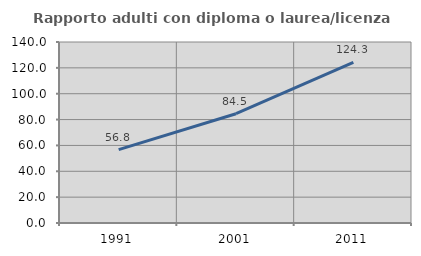
| Category | Rapporto adulti con diploma o laurea/licenza media  |
|---|---|
| 1991.0 | 56.763 |
| 2001.0 | 84.511 |
| 2011.0 | 124.302 |